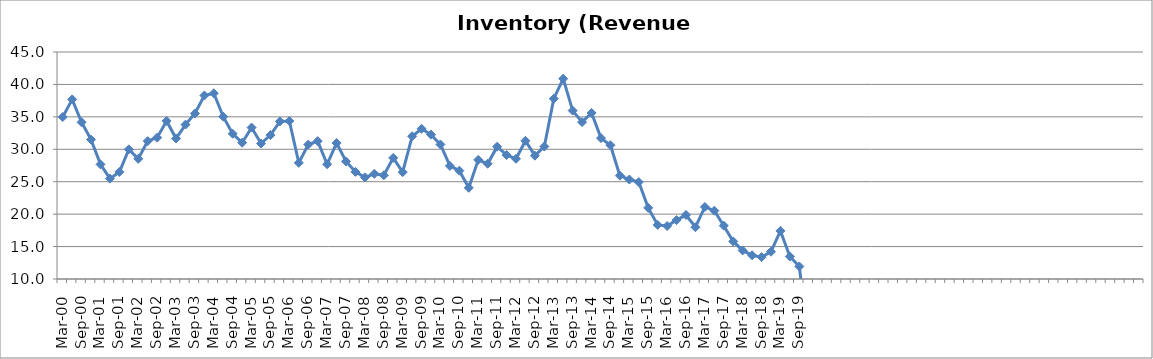
| Category | Inventory (Revenue Days) |
|---|---|
| Mar-00 | 34.975 |
| Jun-00 | 37.69 |
| Sep-00 | 34.168 |
| Dec-00 | 31.492 |
| Mar-01 | 27.673 |
| Jun-01 | 25.477 |
| Sep-01 | 26.502 |
| Dec-01 | 29.992 |
| Mar-02 | 28.537 |
| Jun-02 | 31.268 |
| Sep-02 | 31.796 |
| Dec-02 | 34.37 |
| Mar-03 | 31.665 |
| Jun-03 | 33.812 |
| Sep-03 | 35.52 |
| Dec-03 | 38.3 |
| Mar-04 | 38.641 |
| Jun-04 | 35.026 |
| Sep-04 | 32.393 |
| Dec-04 | 31.017 |
| Mar-05 | 33.346 |
| Jun-05 | 30.89 |
| Sep-05 | 32.19 |
| Dec-05 | 34.302 |
| Mar-06 | 34.359 |
| Jun-06 | 27.909 |
| Sep-06 | 30.729 |
| Dec-06 | 31.265 |
| Mar-07 | 27.694 |
| Jun-07 | 30.961 |
| Sep-07 | 28.129 |
| Dec-07 | 26.518 |
| Mar-08 | 25.671 |
| Jun-08 | 26.222 |
| Sep-08 | 25.99 |
| Dec-08 | 28.671 |
| Mar-09 | 26.478 |
| Jun-09 | 32.003 |
| Sep-09 | 33.161 |
| Dec-09 | 32.256 |
| Mar-10 | 30.74 |
| Jun-10 | 27.436 |
| Sep-10 | 26.705 |
| Dec-10 | 24.061 |
| Mar-11 | 28.368 |
| Jun-11 | 27.771 |
| Sep-11 | 30.399 |
| Dec-11 | 29.117 |
| Mar-12 | 28.537 |
| Jun-12 | 31.309 |
| Sep-12 | 29.016 |
| Dec-12 | 30.42 |
| Mar-13 | 37.797 |
| Jun-13 | 40.89 |
| Sep-13 | 35.965 |
| Dec-13 | 34.189 |
| Mar-14 | 35.599 |
| Jun-14 | 31.725 |
| Sep-14 | 30.622 |
| Dec-14 | 25.94 |
| Mar-15 | 25.338 |
| Jun-15 | 24.951 |
| Sep-15 | 20.965 |
| Dec-15 | 18.339 |
| Mar-16 | 18.168 |
| Jun-16 | 19.079 |
| Sep-16 | 19.874 |
| Dec-16 | 17.986 |
| Mar-17 | 21.11 |
| Jun-17 | 20.533 |
| Sep-17 | 18.223 |
| Dec-17 | 15.791 |
| Mar-18 | 14.408 |
| Jun-18 | 13.654 |
| Sep-18 | 13.377 |
| Dec-18 | 14.209 |
| Mar-19 | 17.416 |
| Jun-19 | 13.466 |
| Sep-19 | 11.931 |